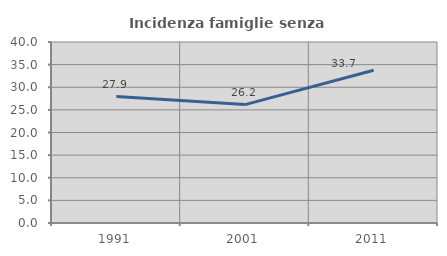
| Category | Incidenza famiglie senza nuclei |
|---|---|
| 1991.0 | 27.941 |
| 2001.0 | 26.171 |
| 2011.0 | 33.741 |